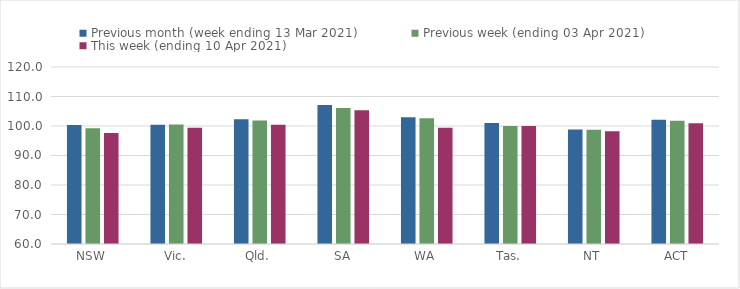
| Category | Previous month (week ending 13 Mar 2021) | Previous week (ending 03 Apr 2021) | This week (ending 10 Apr 2021) |
|---|---|---|---|
| NSW | 100.32 | 99.21 | 97.59 |
| Vic. | 100.46 | 100.49 | 99.37 |
| Qld. | 102.33 | 101.83 | 100.45 |
| SA | 107.11 | 106.09 | 105.36 |
| WA | 102.99 | 102.63 | 99.37 |
| Tas. | 101.05 | 99.98 | 99.98 |
| NT | 98.8 | 98.73 | 98.2 |
| ACT | 102.14 | 101.8 | 100.96 |